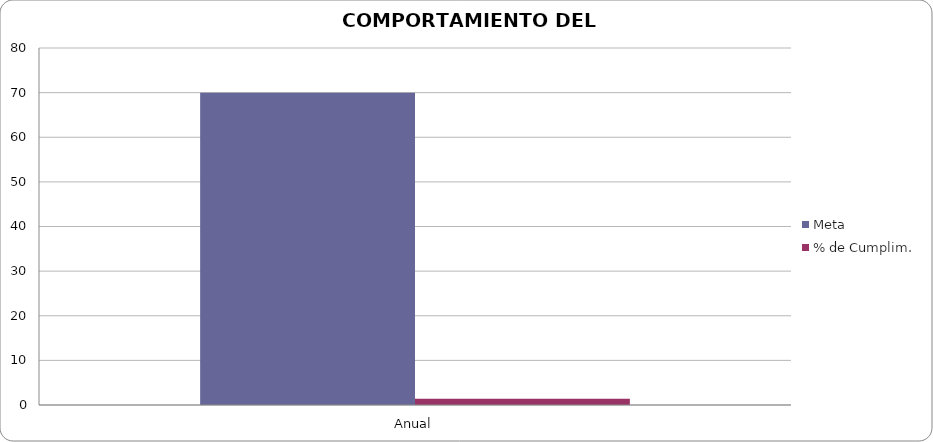
| Category | Meta | % de Cumplim. |
|---|---|---|
| Anual | 70 | 1.429 |